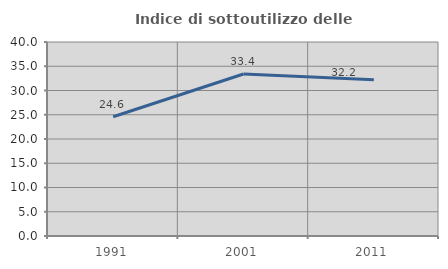
| Category | Indice di sottoutilizzo delle abitazioni  |
|---|---|
| 1991.0 | 24.592 |
| 2001.0 | 33.397 |
| 2011.0 | 32.198 |